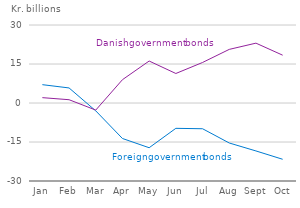
| Category | Foreign government bonds | Danish government bonds |
|---|---|---|
| 2020-01-01 | 7.05 | 2.057 |
| 2020-02-01 | 5.788 | 1.268 |
| 2020-03-01 | -3.021 | -2.724 |
| 2020-04-01 | -13.65 | 8.963 |
| 2020-05-01 | -17.202 | 16.144 |
| 2020-06-01 | -9.742 | 11.349 |
| 2020-07-01 | -9.902 | 15.587 |
| 2020-08-01 | -15.379 | 20.623 |
| 2020-09-01 | -18.44 | 23.021 |
| 2020-10-01 | -21.646 | 18.393 |